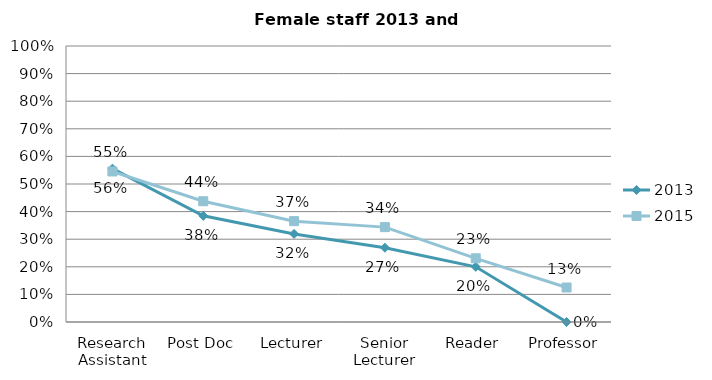
| Category | 2013 | 2015 |
|---|---|---|
| Research Assistant | 0.556 | 0.545 |
| Post Doc | 0.385 | 0.438 |
| Lecturer | 0.319 | 0.365 |
| Senior Lecturer | 0.269 | 0.344 |
| Reader | 0.2 | 0.231 |
| Professor | 0 | 0.125 |